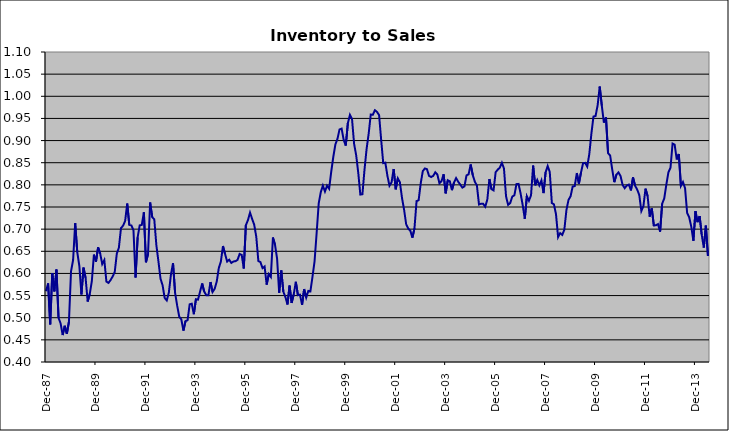
| Category | Series 0 |
|---|---|
| 1983-12-01 | 0.56 |
| 1984-01-01 | 0.578 |
| 1984-02-01 | 0.485 |
| 1984-03-01 | 0.601 |
| 1984-04-01 | 0.559 |
| 1984-05-01 | 0.609 |
| 1984-06-01 | 0.5 |
| 1984-07-01 | 0.487 |
| 1984-08-01 | 0.461 |
| 1984-09-01 | 0.482 |
| 1984-10-01 | 0.464 |
| 1984-11-01 | 0.491 |
| 1984-12-01 | 0.605 |
| 1985-01-01 | 0.63 |
| 1985-02-01 | 0.713 |
| 1985-03-01 | 0.648 |
| 1985-04-01 | 0.617 |
| 1985-05-01 | 0.553 |
| 1985-06-01 | 0.613 |
| 1985-07-01 | 0.59 |
| 1985-08-01 | 0.536 |
| 1985-09-01 | 0.553 |
| 1985-10-01 | 0.582 |
| 1985-11-01 | 0.642 |
| 1985-12-01 | 0.627 |
| 1986-01-01 | 0.659 |
| 1986-02-01 | 0.645 |
| 1986-03-01 | 0.621 |
| 1986-04-01 | 0.63 |
| 1986-05-01 | 0.582 |
| 1986-06-01 | 0.579 |
| 1986-07-01 | 0.585 |
| 1986-08-01 | 0.593 |
| 1986-09-01 | 0.603 |
| 1986-10-01 | 0.645 |
| 1986-11-01 | 0.658 |
| 1986-12-01 | 0.702 |
| 1987-01-01 | 0.708 |
| 1987-02-01 | 0.718 |
| 1987-03-01 | 0.758 |
| 1987-04-01 | 0.71 |
| 1987-05-01 | 0.708 |
| 1987-06-01 | 0.697 |
| 1987-07-01 | 0.591 |
| 1987-08-01 | 0.681 |
| 1987-09-01 | 0.709 |
| 1987-10-01 | 0.71 |
| 1987-11-01 | 0.738 |
| 1987-12-01 | 0.625 |
| 1988-01-01 | 0.644 |
| 1988-02-01 | 0.76 |
| 1988-03-01 | 0.727 |
| 1988-04-01 | 0.722 |
| 1988-05-01 | 0.664 |
| 1988-06-01 | 0.627 |
| 1988-07-01 | 0.588 |
| 1988-08-01 | 0.573 |
| 1988-09-01 | 0.545 |
| 1988-10-01 | 0.539 |
| 1988-11-01 | 0.557 |
| 1988-12-01 | 0.597 |
| 1989-01-01 | 0.623 |
| 1989-02-01 | 0.556 |
| 1989-03-01 | 0.527 |
| 1989-04-01 | 0.502 |
| 1989-05-01 | 0.496 |
| 1989-06-01 | 0.471 |
| 1989-07-01 | 0.492 |
| 1989-08-01 | 0.494 |
| 1989-09-01 | 0.53 |
| 1989-10-01 | 0.532 |
| 1989-11-01 | 0.508 |
| 1989-12-01 | 0.542 |
| 1990-01-01 | 0.541 |
| 1990-02-01 | 0.559 |
| 1990-03-01 | 0.577 |
| 1990-04-01 | 0.559 |
| 1990-05-01 | 0.551 |
| 1990-06-01 | 0.551 |
| 1990-07-01 | 0.581 |
| 1990-08-01 | 0.558 |
| 1990-09-01 | 0.565 |
| 1990-10-01 | 0.581 |
| 1990-11-01 | 0.612 |
| 1990-12-01 | 0.627 |
| 1991-01-01 | 0.662 |
| 1991-02-01 | 0.644 |
| 1991-03-01 | 0.627 |
| 1991-04-01 | 0.631 |
| 1991-05-01 | 0.624 |
| 1991-06-01 | 0.627 |
| 1991-07-01 | 0.628 |
| 1991-08-01 | 0.631 |
| 1991-09-01 | 0.644 |
| 1991-10-01 | 0.642 |
| 1991-11-01 | 0.611 |
| 1991-12-01 | 0.709 |
| 1992-01-01 | 0.72 |
| 1992-02-01 | 0.737 |
| 1992-03-01 | 0.723 |
| 1992-04-01 | 0.71 |
| 1992-05-01 | 0.683 |
| 1992-06-01 | 0.628 |
| 1992-07-01 | 0.626 |
| 1992-08-01 | 0.612 |
| 1992-09-01 | 0.616 |
| 1992-10-01 | 0.575 |
| 1992-11-01 | 0.599 |
| 1992-12-01 | 0.592 |
| 1993-01-01 | 0.681 |
| 1993-02-01 | 0.665 |
| 1993-03-01 | 0.633 |
| 1993-04-01 | 0.556 |
| 1993-05-01 | 0.607 |
| 1993-06-01 | 0.559 |
| 1993-07-01 | 0.547 |
| 1993-08-01 | 0.53 |
| 1993-09-01 | 0.573 |
| 1993-10-01 | 0.533 |
| 1993-11-01 | 0.553 |
| 1993-12-01 | 0.581 |
| 1994-01-01 | 0.551 |
| 1994-02-01 | 0.552 |
| 1994-03-01 | 0.529 |
| 1994-04-01 | 0.565 |
| 1994-05-01 | 0.545 |
| 1994-06-01 | 0.561 |
| 1994-07-01 | 0.56 |
| 1994-08-01 | 0.592 |
| 1994-09-01 | 0.627 |
| 1994-10-01 | 0.691 |
| 1994-11-01 | 0.758 |
| 1994-12-01 | 0.784 |
| 1995-01-01 | 0.798 |
| 1995-02-01 | 0.785 |
| 1995-03-01 | 0.798 |
| 1995-04-01 | 0.791 |
| 1995-05-01 | 0.829 |
| 1995-06-01 | 0.863 |
| 1995-07-01 | 0.891 |
| 1995-08-01 | 0.904 |
| 1995-09-01 | 0.925 |
| 1995-10-01 | 0.927 |
| 1995-11-01 | 0.901 |
| 1995-12-01 | 0.889 |
| 1996-01-01 | 0.939 |
| 1996-02-01 | 0.958 |
| 1996-03-01 | 0.949 |
| 1996-04-01 | 0.892 |
| 1996-05-01 | 0.867 |
| 1996-06-01 | 0.827 |
| 1996-07-01 | 0.778 |
| 1996-08-01 | 0.779 |
| 1996-09-01 | 0.834 |
| 1996-10-01 | 0.881 |
| 1996-11-01 | 0.916 |
| 1996-12-01 | 0.959 |
| 1997-01-01 | 0.958 |
| 1997-02-01 | 0.969 |
| 1997-03-01 | 0.965 |
| 1997-04-01 | 0.958 |
| 1997-05-01 | 0.902 |
| 1997-06-01 | 0.849 |
| 1997-07-01 | 0.85 |
| 1997-08-01 | 0.821 |
| 1997-09-01 | 0.798 |
| 1997-10-01 | 0.806 |
| 1997-11-01 | 0.836 |
| 1997-12-01 | 0.79 |
| 1998-01-01 | 0.815 |
| 1998-02-01 | 0.806 |
| 1998-03-01 | 0.771 |
| 1998-04-01 | 0.744 |
| 1998-05-01 | 0.711 |
| 1998-06-01 | 0.701 |
| 1998-07-01 | 0.697 |
| 1998-08-01 | 0.681 |
| 1998-09-01 | 0.702 |
| 1998-10-01 | 0.763 |
| 1998-11-01 | 0.765 |
| 1998-12-01 | 0.803 |
| 1999-01-01 | 0.831 |
| 1999-02-01 | 0.837 |
| 1999-03-01 | 0.835 |
| 1999-04-01 | 0.82 |
| 1999-05-01 | 0.818 |
| 1999-06-01 | 0.82 |
| 1999-07-01 | 0.828 |
| 1999-08-01 | 0.823 |
| 1999-09-01 | 0.803 |
| 1999-10-01 | 0.809 |
| 1999-11-01 | 0.824 |
| 1999-12-01 | 0.781 |
| 2000-01-01 | 0.81 |
| 2000-02-01 | 0.808 |
| 2000-03-01 | 0.788 |
| 2000-04-01 | 0.805 |
| 2000-05-01 | 0.815 |
| 2000-06-01 | 0.807 |
| 2000-07-01 | 0.801 |
| 2000-08-01 | 0.794 |
| 2000-09-01 | 0.796 |
| 2000-10-01 | 0.821 |
| 2000-11-01 | 0.824 |
| 2000-12-01 | 0.846 |
| 2001-01-01 | 0.822 |
| 2001-02-01 | 0.807 |
| 2001-03-01 | 0.798 |
| 2001-04-01 | 0.756 |
| 2001-05-01 | 0.757 |
| 2001-06-01 | 0.757 |
| 2001-07-01 | 0.751 |
| 2001-08-01 | 0.767 |
| 2001-09-01 | 0.813 |
| 2001-10-01 | 0.79 |
| 2001-11-01 | 0.788 |
| 2001-12-01 | 0.829 |
| 2002-01-01 | 0.834 |
| 2002-02-01 | 0.839 |
| 2002-03-01 | 0.85 |
| 2002-04-01 | 0.837 |
| 2002-05-01 | 0.774 |
| 2002-06-01 | 0.755 |
| 2002-07-01 | 0.759 |
| 2002-08-01 | 0.773 |
| 2002-09-01 | 0.777 |
| 2002-10-01 | 0.802 |
| 2002-11-01 | 0.802 |
| 2002-12-01 | 0.78 |
| 2003-01-01 | 0.754 |
| 2003-02-01 | 0.723 |
| 2003-03-01 | 0.774 |
| 2003-04-01 | 0.764 |
| 2003-05-01 | 0.777 |
| 2003-06-01 | 0.844 |
| 2003-07-01 | 0.799 |
| 2003-08-01 | 0.811 |
| 2003-09-01 | 0.799 |
| 2003-10-01 | 0.81 |
| 2003-11-01 | 0.781 |
| 2003-12-01 | 0.828 |
| 2004-01-01 | 0.843 |
| 2004-02-01 | 0.829 |
| 2004-03-01 | 0.759 |
| 2004-04-01 | 0.756 |
| 2004-05-01 | 0.733 |
| 2004-06-01 | 0.682 |
| 2004-07-01 | 0.691 |
| 2004-08-01 | 0.687 |
| 2004-09-01 | 0.699 |
| 2004-10-01 | 0.743 |
| 2004-11-01 | 0.766 |
| 2004-12-01 | 0.774 |
| 2005-01-01 | 0.796 |
| 2005-02-01 | 0.797 |
| 2005-03-01 | 0.827 |
| 2005-04-01 | 0.803 |
| 2005-05-01 | 0.828 |
| 2005-06-01 | 0.849 |
| 2005-07-01 | 0.85 |
| 2005-08-01 | 0.841 |
| 2005-09-01 | 0.87 |
| 2005-10-01 | 0.916 |
| 2005-11-01 | 0.954 |
| 2005-12-01 | 0.955 |
| 2006-01-01 | 0.98 |
| 2006-02-01 | 1.022 |
| 2006-03-01 | 0.979 |
| 2006-04-01 | 0.941 |
| 2006-05-01 | 0.952 |
| 2006-06-01 | 0.872 |
| 2006-07-01 | 0.866 |
| 2006-08-01 | 0.835 |
| 2006-09-01 | 0.806 |
| 2006-10-01 | 0.823 |
| 2006-11-01 | 0.828 |
| 2006-12-01 | 0.82 |
| 2007-01-01 | 0.8 |
| 2007-02-01 | 0.792 |
| 2007-03-01 | 0.798 |
| 2007-04-01 | 0.801 |
| 2007-05-01 | 0.787 |
| 2007-06-01 | 0.817 |
| 2007-07-01 | 0.798 |
| 2007-08-01 | 0.789 |
| 2007-09-01 | 0.777 |
| 2007-10-01 | 0.741 |
| 2007-11-01 | 0.752 |
| 2007-12-01 | 0.791 |
| 2008-01-01 | 0.775 |
| 2008-02-01 | 0.728 |
| 2008-03-01 | 0.747 |
| 2008-04-01 | 0.708 |
| 2008-05-01 | 0.709 |
| 2008-06-01 | 0.711 |
| 2008-07-01 | 0.694 |
| 2008-08-01 | 0.758 |
| 2008-09-01 | 0.769 |
| 2008-10-01 | 0.8 |
| 2008-11-01 | 0.828 |
| 2008-12-01 | 0.839 |
| 2009-01-01 | 0.893 |
| 2009-02-01 | 0.891 |
| 2009-03-01 | 0.857 |
| 2009-04-01 | 0.87 |
| 2009-05-01 | 0.797 |
| 2009-06-01 | 0.806 |
| 2009-07-01 | 0.793 |
| 2009-08-01 | 0.736 |
| 2009-09-01 | 0.726 |
| 2009-10-01 | 0.705 |
| 2009-11-01 | 0.674 |
| 2009-12-01 | 0.741 |
| 2010-01-01 | 0.716 |
| 2010-02-01 | 0.73 |
| 2010-03-01 | 0.687 |
| 2010-04-01 | 0.658 |
| 2010-05-01 | 0.708 |
| 2010-06-01 | 0.639 |